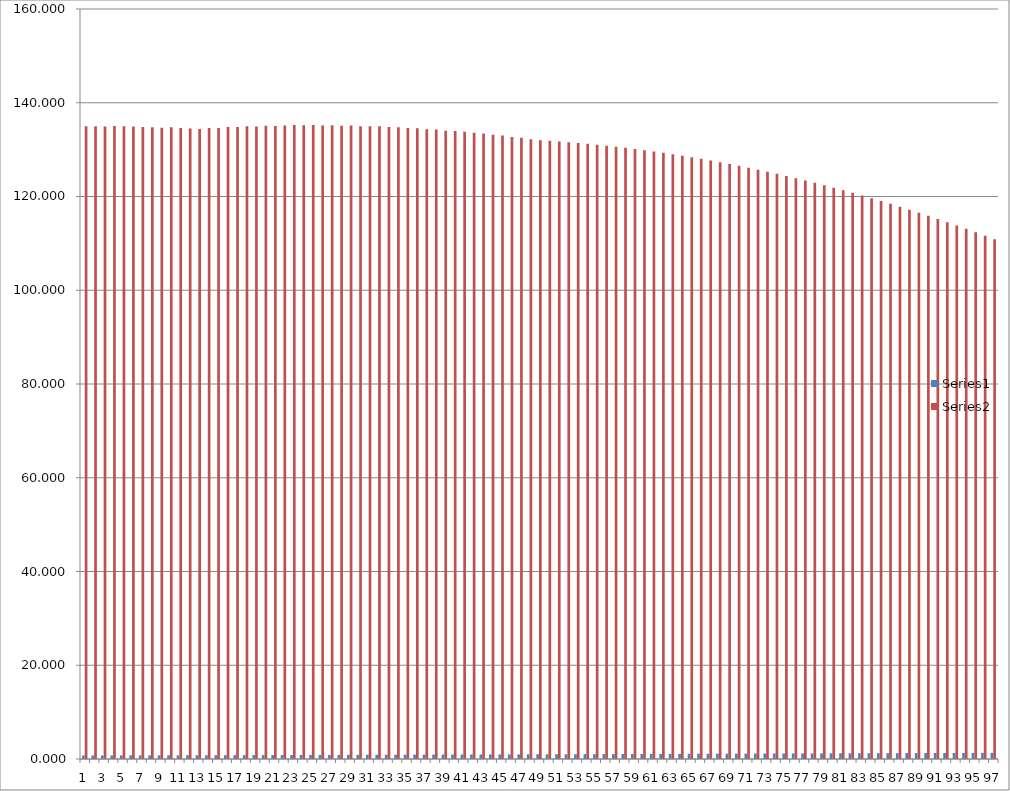
| Category | Series 0 | Series 1 |
|---|---|---|
| 0 | 0.75 | 135 |
| 1 | 0.754 | 134.966 |
| 2 | 0.758 | 134.924 |
| 3 | 0.763 | 135.051 |
| 4 | 0.767 | 134.992 |
| 5 | 0.771 | 134.925 |
| 6 | 0.775 | 134.85 |
| 7 | 0.779 | 134.767 |
| 8 | 0.783 | 134.676 |
| 9 | 0.788 | 134.748 |
| 10 | 0.792 | 134.64 |
| 11 | 0.796 | 134.524 |
| 12 | 0.8 | 134.4 |
| 13 | 0.806 | 134.602 |
| 14 | 0.811 | 134.626 |
| 15 | 0.817 | 134.805 |
| 16 | 0.822 | 134.808 |
| 17 | 0.828 | 134.964 |
| 18 | 0.833 | 134.946 |
| 19 | 0.839 | 135.079 |
| 20 | 0.844 | 135.04 |
| 21 | 0.85 | 135.15 |
| 22 | 0.856 | 135.248 |
| 23 | 0.861 | 135.177 |
| 24 | 0.867 | 135.252 |
| 25 | 0.872 | 135.16 |
| 26 | 0.878 | 135.212 |
| 27 | 0.883 | 135.099 |
| 28 | 0.889 | 135.128 |
| 29 | 0.894 | 134.994 |
| 30 | 0.9 | 135 |
| 31 | 0.906 | 134.994 |
| 32 | 0.911 | 134.828 |
| 33 | 0.917 | 134.799 |
| 34 | 0.922 | 134.612 |
| 35 | 0.928 | 134.56 |
| 36 | 0.933 | 134.352 |
| 37 | 0.939 | 134.277 |
| 38 | 0.944 | 134.048 |
| 39 | 0.95 | 133.95 |
| 40 | 0.956 | 133.84 |
| 41 | 0.961 | 133.579 |
| 42 | 0.967 | 133.446 |
| 43 | 0.972 | 133.164 |
| 44 | 0.978 | 133.008 |
| 45 | 0.983 | 132.705 |
| 46 | 0.989 | 132.526 |
| 47 | 0.994 | 132.202 |
| 48 | 1 | 132 |
| 49 | 1.007 | 131.873 |
| 50 | 1.013 | 131.733 |
| 51 | 1.02 | 131.58 |
| 52 | 1.027 | 131.413 |
| 53 | 1.033 | 131.233 |
| 54 | 1.04 | 131.04 |
| 55 | 1.047 | 130.833 |
| 56 | 1.053 | 130.613 |
| 57 | 1.06 | 130.38 |
| 58 | 1.067 | 130.133 |
| 59 | 1.073 | 129.873 |
| 60 | 1.08 | 129.6 |
| 61 | 1.087 | 129.313 |
| 62 | 1.093 | 129.013 |
| 63 | 1.1 | 128.7 |
| 64 | 1.107 | 128.373 |
| 65 | 1.113 | 128.033 |
| 66 | 1.12 | 127.68 |
| 67 | 1.127 | 127.313 |
| 68 | 1.133 | 126.933 |
| 69 | 1.14 | 126.54 |
| 70 | 1.147 | 126.133 |
| 71 | 1.153 | 125.713 |
| 72 | 1.16 | 125.28 |
| 73 | 1.167 | 124.833 |
| 74 | 1.173 | 124.373 |
| 75 | 1.18 | 123.9 |
| 76 | 1.187 | 123.413 |
| 77 | 1.193 | 122.913 |
| 78 | 1.2 | 122.4 |
| 79 | 1.207 | 121.873 |
| 80 | 1.213 | 121.333 |
| 81 | 1.22 | 120.78 |
| 82 | 1.227 | 120.213 |
| 83 | 1.233 | 119.633 |
| 84 | 1.24 | 119.04 |
| 85 | 1.247 | 118.433 |
| 86 | 1.253 | 117.813 |
| 87 | 1.26 | 117.18 |
| 88 | 1.267 | 116.533 |
| 89 | 1.273 | 115.873 |
| 90 | 1.28 | 115.2 |
| 91 | 1.287 | 114.513 |
| 92 | 1.293 | 113.813 |
| 93 | 1.3 | 113.1 |
| 94 | 1.307 | 112.373 |
| 95 | 1.313 | 111.633 |
| 96 | 1.32 | 110.88 |